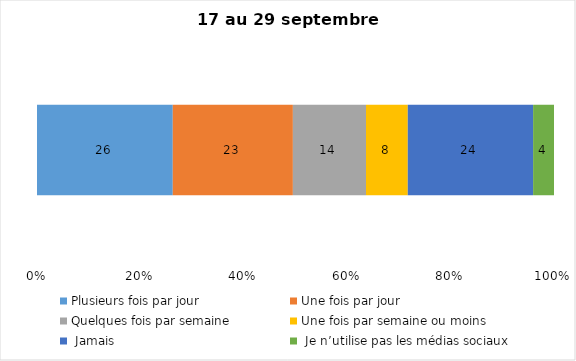
| Category | Plusieurs fois par jour | Une fois par jour | Quelques fois par semaine   | Une fois par semaine ou moins   |  Jamais   |  Je n’utilise pas les médias sociaux |
|---|---|---|---|---|---|---|
| 0 | 26 | 23 | 14 | 8 | 24 | 4 |